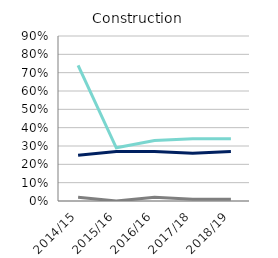
| Category | Employed | Self-Employed | Both |
|---|---|---|---|
| 2014/15 | 0.25 | 0.74 | 0.02 |
| 2015/16 | 0.27 | 0.29 | 0 |
| 2016/16 | 0.27 | 0.33 | 0.02 |
| 2017/18 | 0.26 | 0.34 | 0.01 |
| 2018/19 | 0.27 | 0.34 | 0.01 |